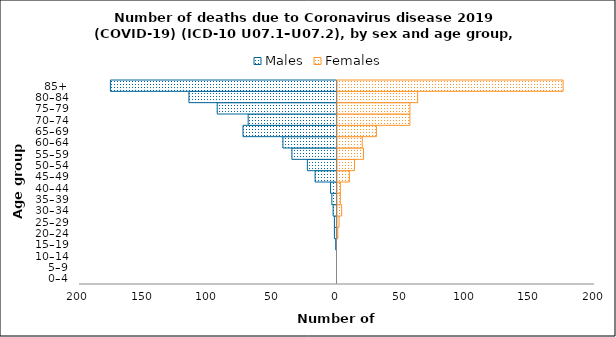
| Category | Males | Females |
|---|---|---|
| 0–4 | 0 | 0 |
| 5–9 | 0 | 0 |
| 10–14 | 0 | 0 |
| 15–19 | -1 | 0 |
| 20–24 | -2 | 1 |
| 25–29 | -2 | 2 |
| 30–34 | -3 | 4 |
| 35–39 | -4 | 3 |
| 40–44 | -5 | 3 |
| 45–49 | -17 | 10 |
| 50–54 | -23 | 14 |
| 55–59 | -35 | 21 |
| 60–64 | -42 | 20 |
| 65–69 | -73 | 31 |
| 70–74 | -69 | 57 |
| 75–79 | -93 | 57 |
| 80–84 | -115 | 63 |
| 85+ | -176 | 176 |